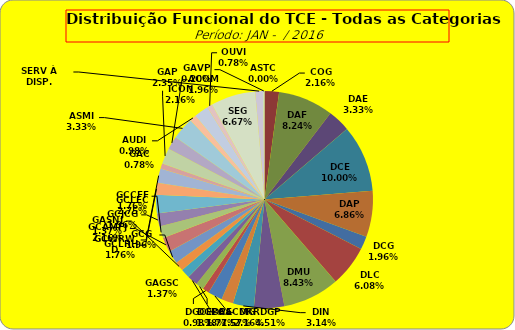
| Category | ASTC COG DAF DAE DCE DAP DCG DLC DMU DGP DIN DPE DRR DGCE DGPA GACMG GAGSC GASNI GCG GCAMFJ GCCFF GCJCG GCLEC GCLRH GCWRWD GAC GAP ACOM ASMI AUDI ICON OUVI SEG SERV À DISP. GAVP |
|---|---|
| ASTC | 0 |
| COG | 11 |
| DAF | 42 |
| DAE | 17 |
| DCE | 51 |
| DAP | 35 |
| DCG | 10 |
| DLC | 31 |
| DMU | 43 |
| DGP | 23 |
| DIN | 16 |
| DPE | 9 |
| DRR | 11 |
| DGCE | 5 |
| DGPA | 6 |
| GACMG | 8 |
| GAGSC | 7 |
| GASNI | 7 |
| GCG | 10 |
| GCAMFJ | 11 |
| GCCFF | 9 |
| GCJCG | 10 |
| GCLEC | 14 |
| GCLRH | 9 |
| GCWRWD | 11 |
| GAC | 4 |
| GAP | 12 |
| ACOM | 10 |
| ASMI | 17 |
| AUDI | 5 |
| ICON | 11 |
| OUVI | 4 |
| SEG | 34 |
| SERV À DISP. | 6 |
| GAVP | 1 |